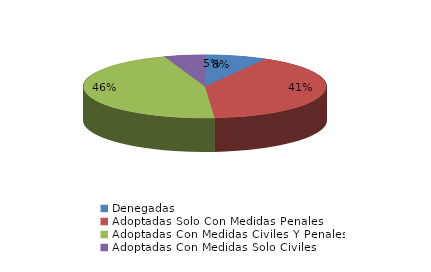
| Category | Series 0 |
|---|---|
| Denegadas | 23 |
| Adoptadas Solo Con Medidas Penales | 113 |
| Adoptadas Con Medidas Civiles Y Penales | 128 |
| Adoptadas Con Medidas Solo Civiles | 15 |